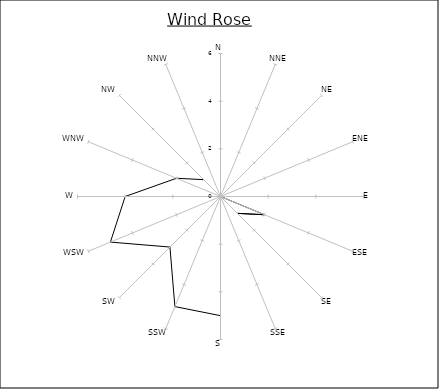
| Category | Series 0 |
|---|---|
| N | 0 |
| NNE | 0 |
| NE | 0 |
| ENE | 0 |
| E | 0 |
| ESE | 2 |
| SE | 1 |
| SSE | 0 |
| S | 5 |
| SSW | 5 |
| SW | 3 |
| WSW | 5 |
| W | 4 |
| WNW | 2 |
| NW | 1 |
| NNW | 0 |